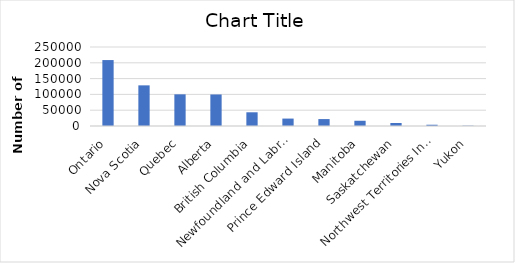
| Category | Series 0 |
|---|---|
| Ontario | 208638 |
| Nova Scotia | 128603 |
| Quebec | 100195 |
| Alberta | 99744 |
| British Columbia | 43390 |
| Newfoundland and Labrador | 23472 |
| Prince Edward Island | 21856 |
| Manitoba | 16559 |
| Saskatchewan | 9461 |
| Northwest Territories Including Nunavut | 4006 |
| Yukon | 893 |